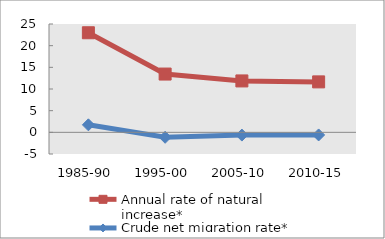
| Category | Annual rate of natural increase* | Crude net migration rate* |
|---|---|---|
| 1985-90 | 22.98 | 1.73 |
| 1995-00 | 13.448 | -1.145 |
| 2005-10 | 11.863 | -0.637 |
| 2010-15 | 11.641 | -0.603 |